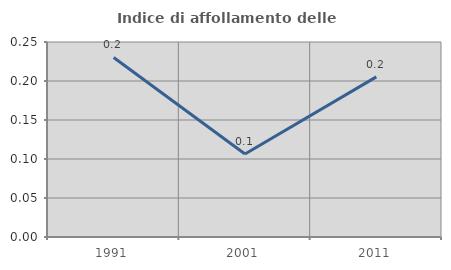
| Category | Indice di affollamento delle abitazioni  |
|---|---|
| 1991.0 | 0.23 |
| 2001.0 | 0.106 |
| 2011.0 | 0.205 |